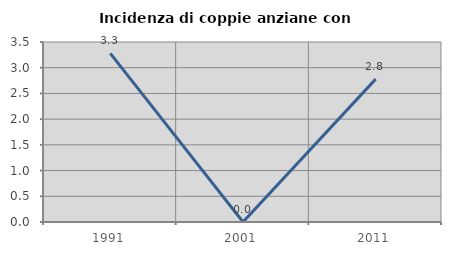
| Category | Incidenza di coppie anziane con figli |
|---|---|
| 1991.0 | 3.279 |
| 2001.0 | 0 |
| 2011.0 | 2.778 |